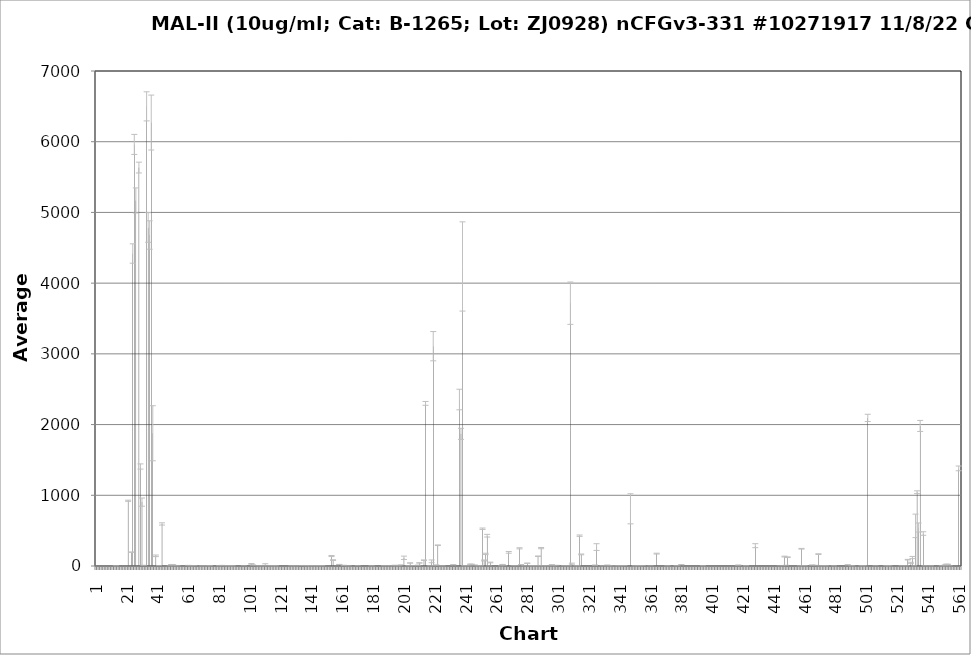
| Category | Average RFU |
|---|---|
| 1.0 | -2.5 |
| 2.0 | -4 |
| 3.0 | -4 |
| 4.0 | -6.75 |
| 5.0 | -3.5 |
| 6.0 | -7.5 |
| 7.0 | -3.25 |
| 8.0 | -8.25 |
| 9.0 | -2.5 |
| 10.0 | -6.75 |
| 11.0 | -6.75 |
| 12.0 | -5.25 |
| 13.0 | -5 |
| 14.0 | -0.5 |
| 15.0 | -2 |
| 16.0 | -3.25 |
| 17.0 | -1.75 |
| 18.0 | -2.75 |
| 19.0 | -1 |
| 20.0 | -1.5 |
| 21.0 | -1.75 |
| 22.0 | 922.75 |
| 23.0 | -1.5 |
| 24.0 | 195.5 |
| 25.0 | 4419 |
| 26.0 | 5961.75 |
| 27.0 | 5169.25 |
| 28.0 | -5.25 |
| 29.0 | 5634.5 |
| 30.0 | 1407 |
| 31.0 | 903.5 |
| 32.0 | -0.25 |
| 33.0 | -2.75 |
| 34.0 | 6500.25 |
| 35.0 | 4787.25 |
| 36.0 | 4680.25 |
| 37.0 | 6271 |
| 38.0 | 1877.25 |
| 39.0 | -3.75 |
| 40.0 | 144 |
| 41.0 | -1.25 |
| 42.0 | 0.25 |
| 43.0 | -1.75 |
| 44.0 | 594.75 |
| 45.0 | -1.25 |
| 46.0 | -3.5 |
| 47.0 | -1.25 |
| 48.0 | -3.75 |
| 49.0 | -0.75 |
| 50.0 | 19.75 |
| 51.0 | 14.75 |
| 52.0 | 6.75 |
| 53.0 | -3 |
| 54.0 | -1.75 |
| 55.0 | -2.5 |
| 56.0 | -1.75 |
| 57.0 | -2 |
| 58.0 | -3.5 |
| 59.0 | -3.5 |
| 60.0 | -3.5 |
| 61.0 | 2 |
| 62.0 | -2.75 |
| 63.0 | -2 |
| 64.0 | -0.75 |
| 65.0 | 0.25 |
| 66.0 | -1.75 |
| 67.0 | -2.5 |
| 68.0 | -0.75 |
| 69.0 | -2.5 |
| 70.0 | 0 |
| 71.0 | -2.5 |
| 72.0 | -2.75 |
| 73.0 | -1.5 |
| 74.0 | -1.25 |
| 75.0 | 3.25 |
| 76.0 | -4.25 |
| 77.0 | -1.25 |
| 78.0 | -6.75 |
| 79.0 | -3 |
| 80.0 | -6.75 |
| 81.0 | -0.25 |
| 82.0 | -2.5 |
| 83.0 | 6.75 |
| 84.0 | 2 |
| 85.0 | -4.25 |
| 86.0 | -2 |
| 87.0 | -1.25 |
| 88.0 | -0.5 |
| 89.0 | -1.5 |
| 90.0 | -0.25 |
| 91.0 | -1 |
| 92.0 | -1 |
| 93.0 | -2.75 |
| 94.0 | -1.25 |
| 95.0 | -3.25 |
| 96.0 | -2.5 |
| 97.0 | 0 |
| 98.0 | -1.5 |
| 99.0 | -2 |
| 100.0 | -1.5 |
| 101.0 | -1.25 |
| 102.0 | 30.25 |
| 103.0 | 12 |
| 104.0 | -2.5 |
| 105.0 | -1.5 |
| 106.0 | -3.75 |
| 107.0 | -0.25 |
| 108.0 | -0.75 |
| 109.0 | -2.5 |
| 110.0 | -0.5 |
| 111.0 | 11 |
| 112.0 | -2.5 |
| 113.0 | -1 |
| 114.0 | -1.25 |
| 115.0 | -1.75 |
| 116.0 | -1.25 |
| 117.0 | 1.25 |
| 118.0 | -0.25 |
| 119.0 | -3.25 |
| 120.0 | -0.75 |
| 121.0 | -1.25 |
| 122.0 | -1 |
| 123.0 | -2.75 |
| 124.0 | -2.5 |
| 125.0 | -6.25 |
| 126.0 | -2 |
| 127.0 | -4.5 |
| 128.0 | -0.5 |
| 129.0 | -4.75 |
| 130.0 | -2 |
| 131.0 | -0.5 |
| 132.0 | -1.25 |
| 133.0 | -0.75 |
| 134.0 | -5 |
| 135.0 | 6.5 |
| 136.0 | -1.75 |
| 137.0 | 0.25 |
| 138.0 | -0.75 |
| 139.0 | -3.75 |
| 140.0 | -0.25 |
| 141.0 | -10.5 |
| 142.0 | 0.25 |
| 143.0 | -2 |
| 144.0 | -0.25 |
| 145.0 | -1.75 |
| 146.0 | -2.5 |
| 147.0 | -5.25 |
| 148.0 | -2 |
| 149.0 | -2.5 |
| 150.0 | -4.25 |
| 151.0 | -3.25 |
| 152.0 | -6.25 |
| 153.0 | -1 |
| 154.0 | 141 |
| 155.0 | 83.25 |
| 156.0 | -3.75 |
| 157.0 | -2 |
| 158.0 | -3.5 |
| 159.0 | 21.75 |
| 160.0 | -1.25 |
| 161.0 | -3.75 |
| 162.0 | 8.25 |
| 163.0 | -2.5 |
| 164.0 | -7.5 |
| 165.0 | -1.5 |
| 166.0 | -2 |
| 167.0 | -0.75 |
| 168.0 | -3.25 |
| 169.0 | -3.75 |
| 170.0 | -6.75 |
| 171.0 | 0 |
| 172.0 | -4.5 |
| 173.0 | -5.5 |
| 174.0 | -3.75 |
| 175.0 | -6.25 |
| 176.0 | -1 |
| 177.0 | -2.75 |
| 178.0 | -1 |
| 179.0 | -5 |
| 180.0 | -1.25 |
| 181.0 | -1.5 |
| 182.0 | -3 |
| 183.0 | -1.5 |
| 184.0 | -3.5 |
| 185.0 | -1.5 |
| 186.0 | -3.25 |
| 187.0 | -18 |
| 188.0 | 2 |
| 189.0 | -2 |
| 190.0 | -2 |
| 191.0 | -3.5 |
| 192.0 | -0.5 |
| 193.0 | -2.5 |
| 194.0 | -1.25 |
| 195.0 | 7 |
| 196.0 | -1 |
| 197.0 | -3.25 |
| 198.0 | 0.75 |
| 199.0 | 5 |
| 200.0 | -20.5 |
| 201.0 | 116 |
| 202.0 | -4.75 |
| 203.0 | -1.5 |
| 204.0 | -1 |
| 205.0 | 42.5 |
| 206.0 | -3 |
| 207.0 | 1.75 |
| 208.0 | -1.5 |
| 209.0 | -3 |
| 210.0 | 10 |
| 211.0 | 43.75 |
| 212.0 | -1 |
| 213.0 | -5.25 |
| 214.0 | 82.25 |
| 215.0 | 2299.5 |
| 216.0 | -0.75 |
| 217.0 | -2.25 |
| 218.0 | 0.75 |
| 219.0 | 66 |
| 220.0 | 3108.5 |
| 221.0 | 2.25 |
| 222.0 | 10.75 |
| 223.0 | 293.5 |
| 224.0 | -3.25 |
| 225.0 | -2.75 |
| 226.0 | -0.5 |
| 227.0 | -1.5 |
| 228.0 | -1.25 |
| 229.0 | -2.5 |
| 230.0 | -7 |
| 231.0 | -3 |
| 232.0 | -5 |
| 233.0 | 17.25 |
| 234.0 | -3.5 |
| 235.0 | -1.25 |
| 236.0 | -2 |
| 237.0 | 2354.25 |
| 238.0 | 1868.5 |
| 239.0 | 4236 |
| 240.0 | -0.5 |
| 241.0 | 0.25 |
| 242.0 | -4.25 |
| 243.0 | -0.5 |
| 244.0 | 22.75 |
| 245.0 | 23.25 |
| 246.0 | -1.5 |
| 247.0 | 6.5 |
| 248.0 | -1.5 |
| 249.0 | -0.5 |
| 250.0 | 0 |
| 251.0 | -0.25 |
| 252.0 | 527 |
| 253.0 | 78.75 |
| 254.0 | 171.25 |
| 255.0 | 428.25 |
| 256.0 | 0.25 |
| 257.0 | 49.5 |
| 258.0 | -2.25 |
| 259.0 | -1.75 |
| 260.0 | -2.25 |
| 261.0 | -8 |
| 262.0 | -1 |
| 263.0 | -1 |
| 264.0 | -0.25 |
| 265.0 | 20.75 |
| 266.0 | 0.75 |
| 267.0 | -3.75 |
| 268.0 | -1.25 |
| 269.0 | 193 |
| 270.0 | -1.25 |
| 271.0 | -1.25 |
| 272.0 | 1.5 |
| 273.0 | -1.75 |
| 274.0 | 0 |
| 275.0 | -8.5 |
| 276.0 | 250 |
| 277.0 | 18.5 |
| 278.0 | -2.5 |
| 279.0 | -0.5 |
| 280.0 | -2.25 |
| 281.0 | 39.25 |
| 282.0 | -1.25 |
| 283.0 | 0 |
| 284.0 | 0 |
| 285.0 | 1.5 |
| 286.0 | -3 |
| 287.0 | 3 |
| 288.0 | 138 |
| 289.0 | -0.25 |
| 290.0 | 253 |
| 291.0 | 0.25 |
| 292.0 | -0.5 |
| 293.0 | -3 |
| 294.0 | -0.5 |
| 295.0 | -3.75 |
| 296.0 | -1.5 |
| 297.0 | 16 |
| 298.0 | -1 |
| 299.0 | -5.25 |
| 300.0 | 3.25 |
| 301.0 | -2.5 |
| 302.0 | -2.25 |
| 303.0 | -8 |
| 304.0 | -2.5 |
| 305.0 | -0.5 |
| 306.0 | -1.75 |
| 307.0 | -1.25 |
| 308.0 | -0.75 |
| 309.0 | 3716.5 |
| 310.0 | 28.75 |
| 311.0 | -0.75 |
| 312.0 | -3 |
| 313.0 | -0.25 |
| 314.0 | -1 |
| 315.0 | 428.75 |
| 316.0 | 164 |
| 317.0 | -1.25 |
| 318.0 | -3 |
| 319.0 | -22.75 |
| 320.0 | -1.75 |
| 321.0 | -2.75 |
| 322.0 | -1.25 |
| 323.0 | -3.25 |
| 324.0 | -1.25 |
| 325.0 | 10.75 |
| 326.0 | 267.75 |
| 327.0 | -3 |
| 328.0 | -1.5 |
| 329.0 | -1.5 |
| 330.0 | -0.5 |
| 331.0 | -1.5 |
| 332.0 | -10.75 |
| 333.0 | 5.75 |
| 334.0 | -0.5 |
| 335.0 | -0.25 |
| 336.0 | -2.25 |
| 337.0 | -0.75 |
| 338.0 | -4 |
| 339.0 | 0 |
| 340.0 | 1.25 |
| 341.0 | -0.5 |
| 342.0 | -16.5 |
| 343.0 | -2.5 |
| 344.0 | 5.25 |
| 345.0 | -1.25 |
| 346.0 | -3.75 |
| 347.0 | -1.25 |
| 348.0 | 808.75 |
| 349.0 | -3.25 |
| 350.0 | -3.5 |
| 351.0 | -1 |
| 352.0 | -2 |
| 353.0 | 0.25 |
| 354.0 | -1.25 |
| 355.0 | -21 |
| 356.0 | 0.75 |
| 357.0 | -2.75 |
| 358.0 | -1 |
| 359.0 | -2 |
| 360.0 | -1.5 |
| 361.0 | 0.25 |
| 362.0 | -3.25 |
| 363.0 | -1.5 |
| 364.0 | -14.75 |
| 365.0 | 175 |
| 366.0 | -10.25 |
| 367.0 | -2.25 |
| 368.0 | -7.5 |
| 369.0 | -4.75 |
| 370.0 | -6 |
| 371.0 | -1.75 |
| 372.0 | -1 |
| 373.0 | -2.5 |
| 374.0 | -1.25 |
| 375.0 | -2.5 |
| 376.0 | -2 |
| 377.0 | -1.75 |
| 378.0 | -1.5 |
| 379.0 | -2 |
| 380.0 | -3 |
| 381.0 | 18.75 |
| 382.0 | -5.25 |
| 383.0 | -1.75 |
| 384.0 | -17.75 |
| 385.0 | -2.5 |
| 386.0 | -2 |
| 387.0 | -18 |
| 388.0 | -2.5 |
| 389.0 | -7.75 |
| 390.0 | -2.75 |
| 391.0 | -7.5 |
| 392.0 | -5.75 |
| 393.0 | -4 |
| 394.0 | -3 |
| 395.0 | -0.5 |
| 396.0 | -1.75 |
| 397.0 | -1.25 |
| 398.0 | -2.5 |
| 399.0 | -2 |
| 400.0 | -2.25 |
| 401.0 | -3.25 |
| 402.0 | -2.25 |
| 403.0 | -3.25 |
| 404.0 | -1.5 |
| 405.0 | -5.5 |
| 406.0 | -1.5 |
| 407.0 | -13.75 |
| 408.0 | -18.25 |
| 409.0 | -3.5 |
| 410.0 | -3.5 |
| 411.0 | -7.25 |
| 412.0 | -4 |
| 413.0 | -6.25 |
| 414.0 | -5 |
| 415.0 | -2.75 |
| 416.0 | -11.25 |
| 417.0 | -3.5 |
| 418.0 | 10.25 |
| 419.0 | -2.25 |
| 420.0 | -3 |
| 421.0 | -1.25 |
| 422.0 | -5.75 |
| 423.0 | -0.25 |
| 424.0 | -3 |
| 425.0 | -3.25 |
| 426.0 | -1.5 |
| 427.0 | -4 |
| 428.0 | -1.5 |
| 429.0 | 287.5 |
| 430.0 | -2.75 |
| 431.0 | -3.75 |
| 432.0 | -4.75 |
| 433.0 | -6.5 |
| 434.0 | -2.5 |
| 435.0 | -1.75 |
| 436.0 | -4.75 |
| 437.0 | -4.5 |
| 438.0 | -6.5 |
| 439.0 | -4.25 |
| 440.0 | -6.25 |
| 441.0 | -3.75 |
| 442.0 | -2.25 |
| 443.0 | -1.75 |
| 444.0 | -2.75 |
| 445.0 | 0.5 |
| 446.0 | -5.25 |
| 447.0 | 0.75 |
| 448.0 | 133.5 |
| 449.0 | 2.75 |
| 450.0 | 124.25 |
| 451.0 | -3 |
| 452.0 | -1.75 |
| 453.0 | -2.25 |
| 454.0 | -1.75 |
| 455.0 | -3.75 |
| 456.0 | -2 |
| 457.0 | -2 |
| 458.0 | 0 |
| 459.0 | 243.75 |
| 460.0 | 1 |
| 461.0 | 3.25 |
| 462.0 | -1.75 |
| 463.0 | -3.75 |
| 464.0 | -2.25 |
| 465.0 | -2 |
| 466.0 | 12.75 |
| 467.0 | -1 |
| 468.0 | 4 |
| 469.0 | -1 |
| 470.0 | 168 |
| 471.0 | -2.75 |
| 472.0 | -2.75 |
| 473.0 | 0.5 |
| 474.0 | 0.25 |
| 475.0 | -1.75 |
| 476.0 | -2 |
| 477.0 | -1 |
| 478.0 | -2.75 |
| 479.0 | -3.75 |
| 480.0 | 0.75 |
| 481.0 | -5.5 |
| 482.0 | -4.75 |
| 483.0 | -3.25 |
| 484.0 | -4.25 |
| 485.0 | -3.75 |
| 486.0 | -8.5 |
| 487.0 | -2 |
| 488.0 | -4.5 |
| 489.0 | 16 |
| 490.0 | -1.5 |
| 491.0 | -2 |
| 492.0 | -1 |
| 493.0 | -6.5 |
| 494.0 | -4.5 |
| 495.0 | -2.5 |
| 496.0 | -1.75 |
| 497.0 | -3.75 |
| 498.0 | -0.75 |
| 499.0 | -1.5 |
| 500.0 | 0 |
| 501.0 | -3.75 |
| 502.0 | 2094.25 |
| 503.0 | -4.75 |
| 504.0 | -2 |
| 505.0 | -4.25 |
| 506.0 | -3.5 |
| 507.0 | 0 |
| 508.0 | -20.5 |
| 509.0 | -4 |
| 510.0 | -9 |
| 511.0 | -3.5 |
| 512.0 | -7 |
| 513.0 | -2.5 |
| 514.0 | 0 |
| 515.0 | -1 |
| 516.0 | 0 |
| 517.0 | -2.5 |
| 518.0 | -2.25 |
| 519.0 | -3 |
| 520.0 | -4 |
| 521.0 | -2 |
| 522.0 | -2.25 |
| 523.0 | -4.75 |
| 524.0 | -1.5 |
| 525.0 | -2 |
| 526.0 | -3 |
| 527.0 | -0.5 |
| 528.0 | 89.5 |
| 529.0 | -1.25 |
| 530.0 | 45.5 |
| 531.0 | 119.5 |
| 532.0 | -1 |
| 533.0 | 567.5 |
| 534.0 | 1043.25 |
| 535.0 | 544.25 |
| 536.0 | 1980.75 |
| 537.0 | -4 |
| 538.0 | 459.25 |
| 539.0 | -0.25 |
| 540.0 | -7.5 |
| 541.0 | -1.25 |
| 542.0 | -5 |
| 543.0 | -0.75 |
| 544.0 | -4.5 |
| 545.0 | -3.25 |
| 546.0 | -5.5 |
| 547.0 | -3 |
| 548.0 | -2 |
| 549.0 | -3.75 |
| 550.0 | -4 |
| 551.0 | 0 |
| 552.0 | 12 |
| 553.0 | 24 |
| 554.0 | 22.5 |
| 555.0 | -0.5 |
| 556.0 | -3.75 |
| 557.0 | -2 |
| 558.0 | -2.75 |
| 559.0 | -2.25 |
| 560.0 | -0.75 |
| 561.0 | 1380.5 |
| 562.0 | -4 |